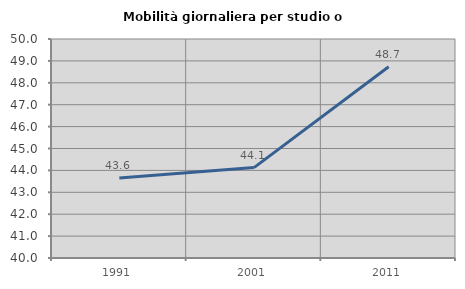
| Category | Mobilità giornaliera per studio o lavoro |
|---|---|
| 1991.0 | 43.648 |
| 2001.0 | 44.128 |
| 2011.0 | 48.736 |